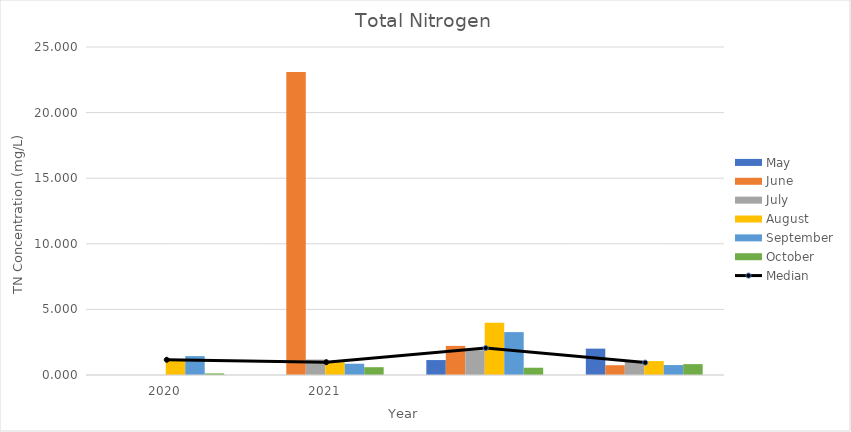
| Category | May | June | July | August | September | October |
|---|---|---|---|---|---|---|
| 2020.0 | 0 | 0 | 0 | 1.16 | 1.44 | 0.122 |
| 2021.0 | 0 | 23.1 | 1.18 | 0.976 | 0.858 | 0.594 |